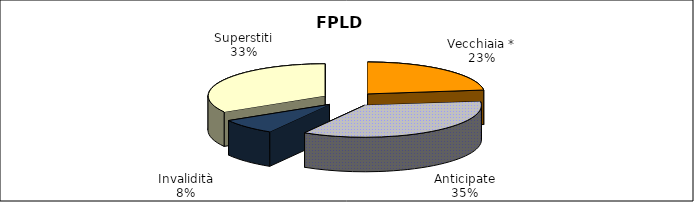
| Category | Series 0 |
|---|---|
| Vecchiaia * | 81787 |
| Anticipate | 125888 |
| Invalidità | 28444 |
| Superstiti | 118697 |